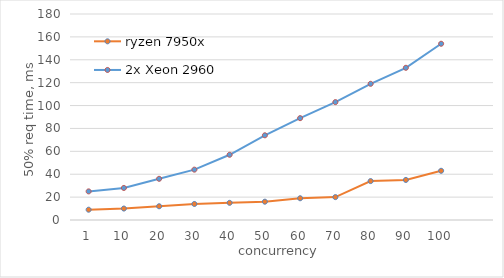
| Category | ryzen 7950x | 2x Xeon 2960 v1 |
|---|---|---|
| 1 | 9 | 25 |
| 10 | 10 | 28 |
| 20 | 12 | 36 |
| 30 | 14 | 44 |
| 40 | 15 | 57 |
| 50 | 16 | 74 |
| 60 | 19 | 89 |
| 70 | 20 | 103 |
| 80 | 34 | 119 |
| 90 | 35 | 133 |
| 100 | 43 | 154 |